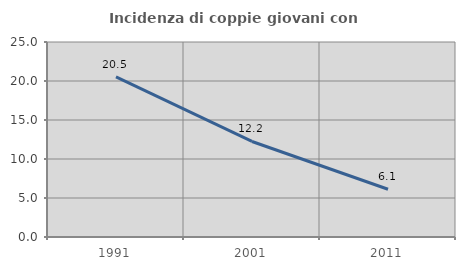
| Category | Incidenza di coppie giovani con figli |
|---|---|
| 1991.0 | 20.534 |
| 2001.0 | 12.248 |
| 2011.0 | 6.123 |